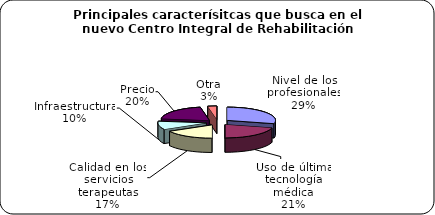
| Category | Series 0 |
|---|---|
| Nivel de los profesionales | 0.29 |
| Uso de última tecnología médica | 0.21 |
| Calidad en los servicios terapeutas | 0.17 |
| Infraestructura | 0.1 |
| Precio | 0.2 |
| Otra | 0.03 |